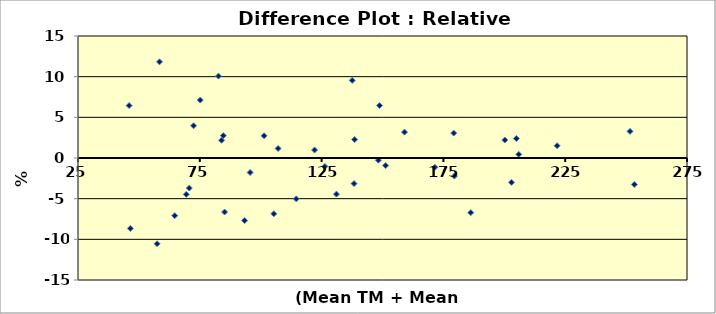
| Category | Difference % |
|---|---|
| 83.91607599561475 | 2.183 |
| 159.03113645477652 | 3.183 |
| 200.20928553043404 | 2.207 |
| 46.48705068917253 | -8.66 |
| 70.69323914993933 | -3.697 |
| 179.24521099260528 | 3.063 |
| 221.67248383747818 | 1.509 |
| 138.56881437851706 | 2.264 |
| 171.51536430065255 | -1.148 |
| 82.66257107247608 | 10.071 |
| 148.30479468596243 | -0.263 |
| 251.61552883647502 | 3.271 |
| 45.981793304464546 | 6.445 |
| 93.40731368776811 | -7.693 |
| 72.43535307287735 | 3.963 |
| 58.45638261170929 | 11.826 |
| 151.3004135320391 | -0.925 |
| 205.95227568415675 | 0.439 |
| 105.38628414893617 | -6.858 |
| 122.09948245598028 | 0.982 |
| 131.089843917349 | -4.44 |
| 101.38453168736685 | 2.731 |
| 204.95052322258744 | 2.391 |
| 69.44586784229332 | -4.476 |
| 186.24871591574396 | -6.713 |
| 95.64855137992147 | -1.78 |
| 137.56180453223973 | 9.54 |
| 114.6187595332429 | -5.028 |
| 85.17045714953807 | -6.644 |
| 202.96366668435738 | -2.992 |
| 148.7951561473311 | 6.445 |
| 75.17834322660005 | 7.125 |
| 57.469526073479244 | -10.546 |
| 179.50309706966726 | -2.225 |
| 253.37691983667565 | -3.255 |
| 126.3442250712723 | -1.038 |
| 84.66432353404542 | 2.75 |
| 64.70550638092462 | -7.092 |
| 138.32582422479436 | -3.144 |
| 107.12576937952021 | 1.168 |